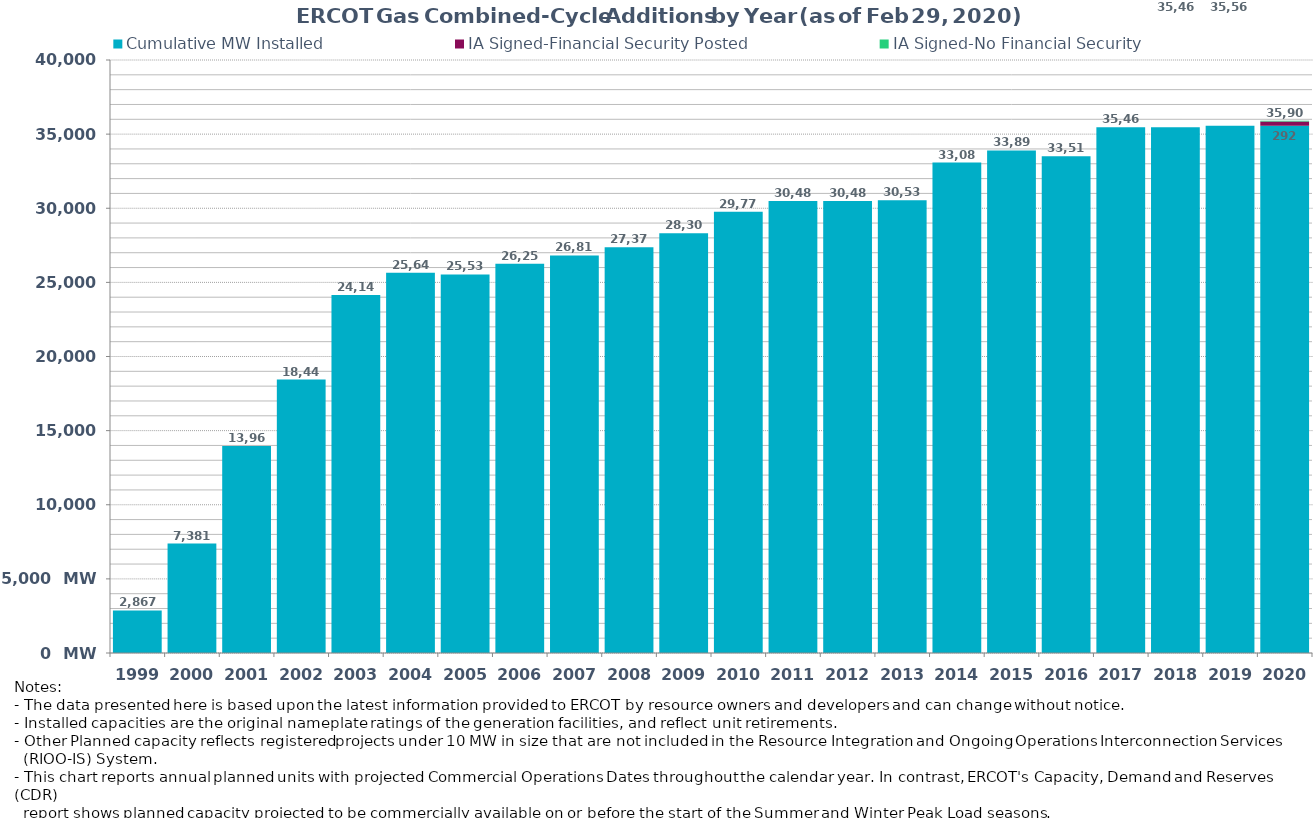
| Category | Cumulative MW Installed | IA Signed-Financial Security Posted  | IA Signed-No Financial Security  | Other Planned | Cumulative Installed and Planned |
|---|---|---|---|---|---|
| 1999.0 | 2867 | 0 | 0 | 0 | 2867 |
| 2000.0 | 7381 | 0 | 0 | 0 | 7381 |
| 2001.0 | 13967 | 0 | 0 | 0 | 13967 |
| 2002.0 | 18443 | 0 | 0 | 0 | 18443 |
| 2003.0 | 24141 | 0 | 0 | 0 | 24141 |
| 2004.0 | 25641 | 0 | 0 | 0 | 25641 |
| 2005.0 | 25539 | 0 | 0 | 0 | 25539 |
| 2006.0 | 26258 | 0 | 0 | 0 | 26258 |
| 2007.0 | 26815 | 0 | 0 | 0 | 26815 |
| 2008.0 | 27376 | 0 | 0 | 0 | 27376 |
| 2009.0 | 28309 | 0 | 0 | 0 | 28309 |
| 2010.0 | 29770 | 0 | 0 | 0 | 29770 |
| 2011.0 | 30488 | 0 | 0 | 0 | 30488 |
| 2012.0 | 30488 | 0 | 0 | 0 | 30488 |
| 2013.0 | 30538 | 0 | 0 | 0 | 30538 |
| 2014.0 | 33080 | 0 | 0 | 0 | 33080 |
| 2015.0 | 33897 | 0 | 0 | 0 | 33897 |
| 2016.0 | 33515 | 0 | 0 | 0 | 33515 |
| 2017.0 | 35465 | 0 | 0 | 0 | 35465 |
| 2018.0 | 35465 | 0 | 0 | 0 | 35465 |
| 2019.0 | 35564 | 0 | 0 | 0 | 35564 |
| 2020.0 | 35564 | 292 | 45 | 0 | 35901 |